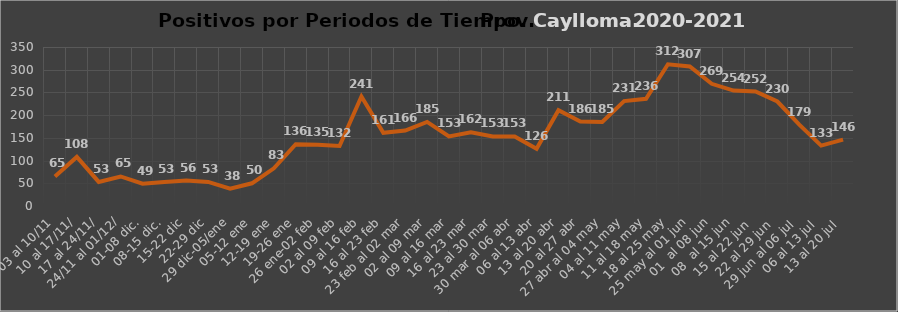
| Category | Prov. Caylloma  |
|---|---|
| 03 al 10/11 | 65 |
| 10 al 17/11/ | 108 |
|  17 al 24/11/ | 53 |
|  24/11 al 01/12/ | 65 |
| 01-08 dic. | 49 |
| 08-15 dic. | 53 |
| 15-22 dic | 56 |
| 22-29 dic | 53 |
| 29 dic-05/ene | 38 |
| 05-12 ene | 50 |
| 12-19 ene | 83 |
| 19-26 ene | 136 |
| 26 ene-02 feb | 135 |
| 02 al 09 feb | 132 |
| 09 al 16 feb | 241 |
| 16 al 23 feb | 161 |
| 23 feb al 02 mar | 166 |
|  02 al 09 mar | 185 |
|  09 al 16 mar | 153 |
|  16 al 23 mar | 162 |
|  23 al 30 mar | 153 |
|  30 mar al 06 abr | 153 |
| 06 al 13 abr | 126 |
| 13 al 20 abr | 211 |
| 20 al 27 abr | 186 |
| 27 abr al 04 may | 185 |
|  04 al 11 may | 231 |
|  11 al 18 may | 236 |
|  18 al 25 may | 312 |
|  25 may al 01 jun | 307 |
|  01  al 08 jun | 269 |
|  08  al 15 jun | 254 |
|  15 al 22 jun  | 252 |
|  22 al 29 jun  | 230 |
|   29 jun al 06 jul  | 179 |
|    06 al 13 jul  | 133 |
|    13 al 20 jul  | 146 |